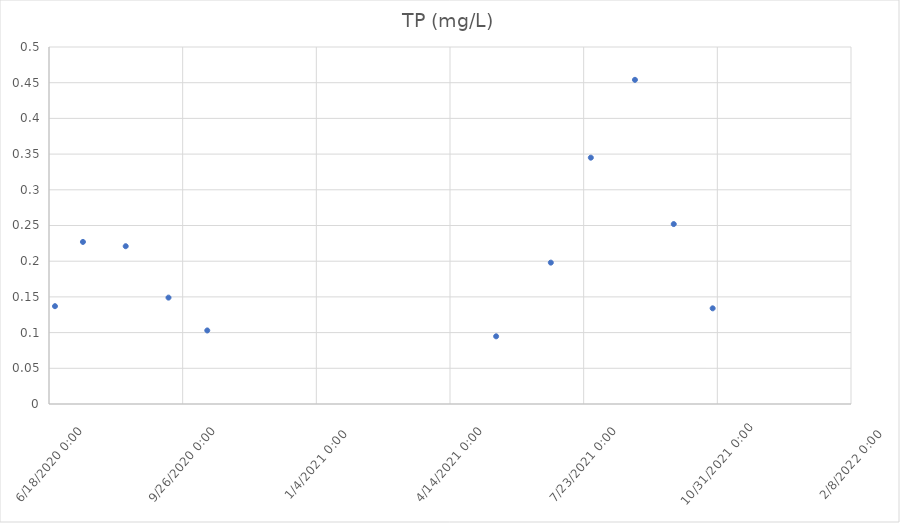
| Category | TP (mg/L) |
|---|---|
| 44004.47361111111 | 0.137 |
| 44025.39375 | 0.227 |
| 44057.39027777778 | 0.221 |
| 44089.402083333334 | 0.149 |
| 44118.40972222222 | 0.103 |
| 44334.510416666664 | 0.095 |
| 44375.427083333336 | 0.198 |
| 44405.35763888889 | 0.345 |
| 44438.364583333336 | 0.454 |
| 44467.39236111111 | 0.252 |
| 44496.510416666664 | 0.134 |